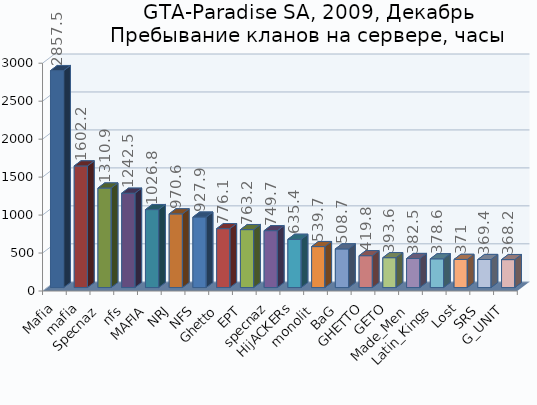
| Category | Series 0 |
|---|---|
| Mafia | 2857.5 |
| mafia | 1602.2 |
| Specnaz | 1310.9 |
| nfs | 1242.5 |
| MAFIA | 1026.8 |
| NRJ | 970.6 |
| NFS | 927.9 |
| Ghetto | 776.1 |
| EPT | 763.2 |
| specnaz | 749.7 |
| HijACKERs | 635.4 |
| monolit | 539.7 |
| BaG | 508.7 |
| GHETTO | 419.8 |
| GETO | 393.6 |
| Made_Men | 382.5 |
| Latin_Kings | 378.6 |
| Lost | 371 |
| SRS | 369.4 |
| G_UNIT | 368.2 |